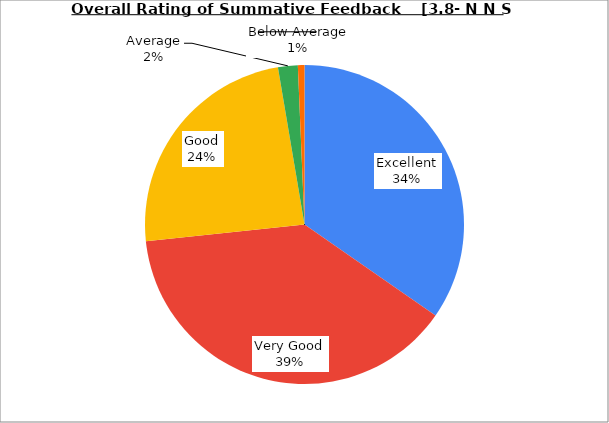
| Category | Series 0 |
|---|---|
| Excellent | 34.667 |
| Very Good | 38.667 |
| Good | 24 |
| Average | 2 |
| Below Average | 0.667 |